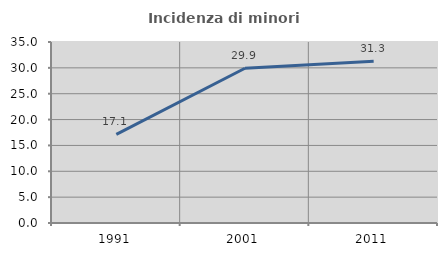
| Category | Incidenza di minori stranieri |
|---|---|
| 1991.0 | 17.143 |
| 2001.0 | 29.928 |
| 2011.0 | 31.256 |